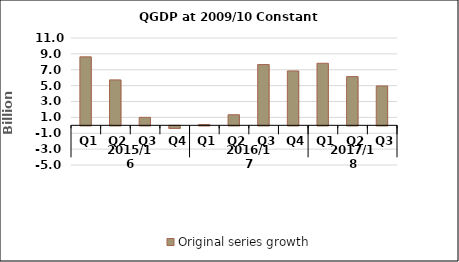
| Category | Original series growth |
|---|---|
| 0 | 8.623 |
| 1 | 5.719 |
| 2 | 1 |
| 3 | -0.319 |
| 4 | 0.087 |
| 5 | 1.33 |
| 6 | 7.654 |
| 7 | 6.851 |
| 8 | 7.816 |
| 9 | 6.136 |
| 10 | 4.961 |